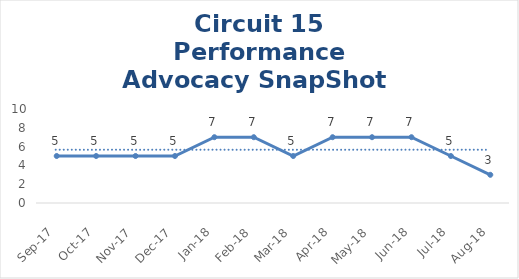
| Category | Circuit 15 |
|---|---|
| Sep-17 | 5 |
| Oct-17 | 5 |
| Nov-17 | 5 |
| Dec-17 | 5 |
| Jan-18 | 7 |
| Feb-18 | 7 |
| Mar-18 | 5 |
| Apr-18 | 7 |
| May-18 | 7 |
| Jun-18 | 7 |
| Jul-18 | 5 |
| Aug-18 | 3 |